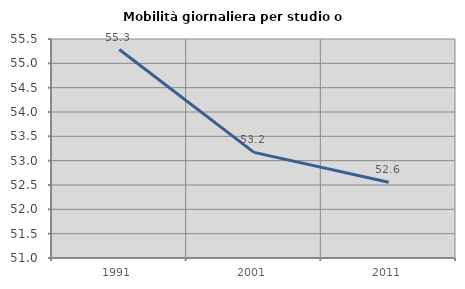
| Category | Mobilità giornaliera per studio o lavoro |
|---|---|
| 1991.0 | 55.284 |
| 2001.0 | 53.171 |
| 2011.0 | 52.556 |